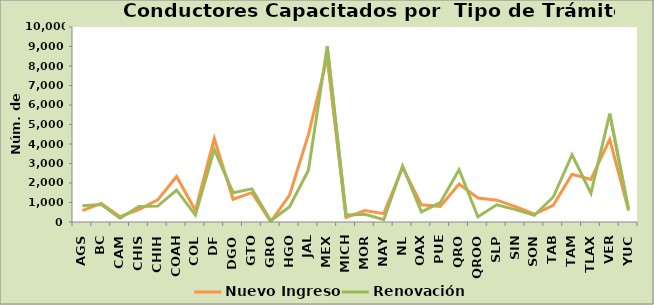
| Category | Nuevo Ingreso | Renovación |
|---|---|---|
| AGS | 585 | 830 |
| BC | 952 | 891 |
| CAM | 274 | 196 |
| CHIS | 631 | 794 |
| CHIH | 1133 | 814 |
| COAH | 2336 | 1635 |
| COL | 596 | 356 |
| DF | 4290 | 3727 |
| DGO | 1166 | 1504 |
| GTO | 1503 | 1700 |
| GRO | 12 | 62 |
| HGO | 1380 | 788 |
| JAL | 4482 | 2654 |
| MEX | 8460 | 9016 |
| MICH | 240 | 353 |
| MOR | 590 | 399 |
| NAY | 430 | 120 |
| NL | 2789 | 2873 |
| OAX | 886 | 516 |
| PUE | 802 | 990 |
| QRO | 1947 | 2678 |
| QROO | 1232 | 263 |
| SLP | 1118 | 879 |
| SIN | 793 | 637 |
| SON | 407 | 338 |
| TAB | 852 | 1282 |
| TAM | 2445 | 3449 |
| TLAX | 2179 | 1474 |
| VER | 4242 | 5558 |
| YUC | 582 | 628 |